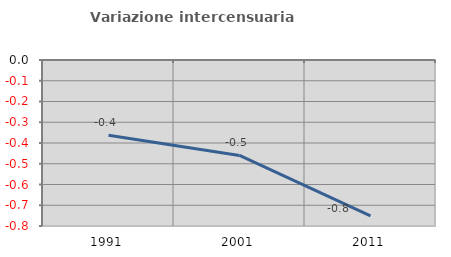
| Category | Variazione intercensuaria annua |
|---|---|
| 1991.0 | -0.362 |
| 2001.0 | -0.46 |
| 2011.0 | -0.751 |